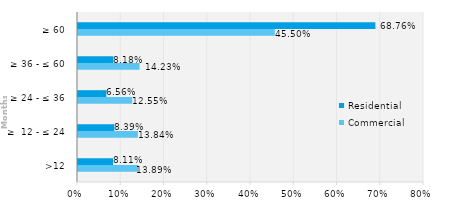
| Category | Commercial | Residential |
|---|---|---|
| >12 | 0.139 | 0.081 |
| ≥  12 - ≤ 24 | 0.138 | 0.084 |
| ≥ 24 - ≤ 36 | 0.125 | 0.066 |
| ≥ 36 - ≤ 60 | 0.142 | 0.082 |
| ≥ 60 | 0.455 | 0.688 |